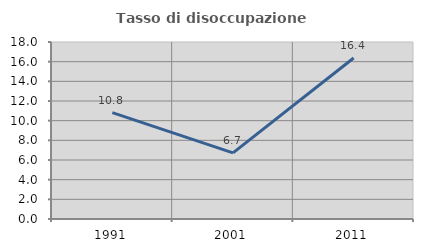
| Category | Tasso di disoccupazione giovanile  |
|---|---|
| 1991.0 | 10.811 |
| 2001.0 | 6.729 |
| 2011.0 | 16.376 |